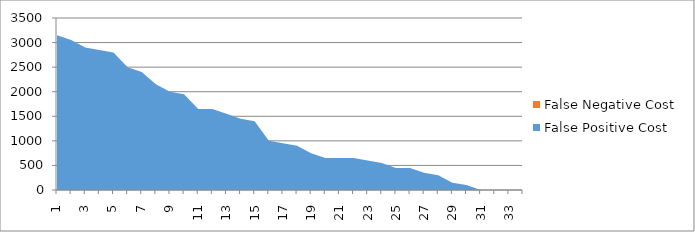
| Category | False Positive Cost | False Negative Cost |
|---|---|---|
| 0 | 630 |  |
| 1 | 610 |  |
| 2 | 580 |  |
| 3 | 570 |  |
| 4 | 560 |  |
| 5 | 500 |  |
| 6 | 480 |  |
| 7 | 430 |  |
| 8 | 400 |  |
| 9 | 390 |  |
| 10 | 330 |  |
| 11 | 330 |  |
| 12 | 310 |  |
| 13 | 290 |  |
| 14 | 280 |  |
| 15 | 200 |  |
| 16 | 190 |  |
| 17 | 180 |  |
| 18 | 150 |  |
| 19 | 130 |  |
| 20 | 130 |  |
| 21 | 130 |  |
| 22 | 120 |  |
| 23 | 110 |  |
| 24 | 90 |  |
| 25 | 90 |  |
| 26 | 70 |  |
| 27 | 60 |  |
| 28 | 30 |  |
| 29 | 20 |  |
| 30 | 0 |  |
| 31 | 0 |  |
| 32 | 0 |  |
| 33 | 0 |  |